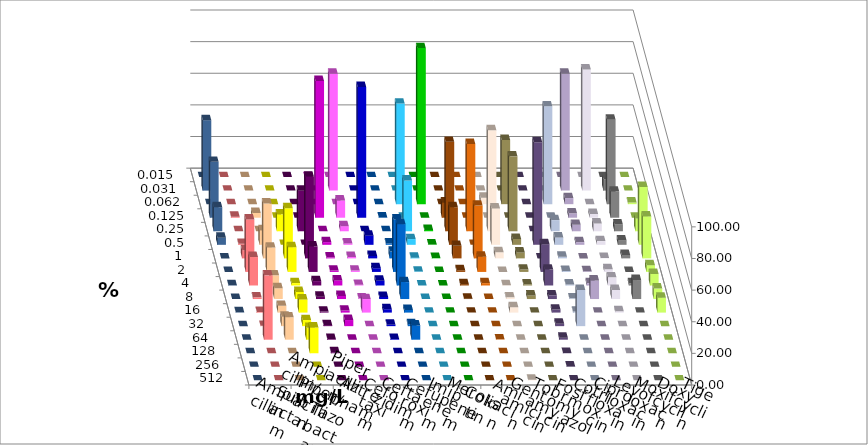
| Category | Ampicillin | Ampicillin/ Sulbactam | Piperacillin | Piperacillin/ Tazobactam | Aztreonam | Cefotaxim | Ceftazidim | Cefuroxim | Imipenem | Meropenem | Colistin | Amikacin | Gentamicin | Tobramycin | Fosfomycin | Cotrimoxazol | Ciprofloxacin | Levofloxacin | Moxifloxacin | Doxycyclin | Tigecyclin |
|---|---|---|---|---|---|---|---|---|---|---|---|---|---|---|---|---|---|---|---|---|---|
| 0.015 | 0 | 0 | 0 | 0 | 0 | 0 | 0 | 0 | 0 | 0 | 0 | 0 | 0 | 0 | 0 | 0 | 0 | 0 | 0 | 0 | 0 |
| 0.031 | 0 | 0 | 0 | 0 | 0 | 73.876 | 0 | 0 | 0 | 0 | 0 | 0 | 0 | 0 | 0 | 0 | 73.876 | 76.66 | 7.296 | 0 | 44.54 |
| 0.062 | 0 | 0 | 0 | 0 | 0 | 0 | 0 | 0 | 63.597 | 98.715 | 0 | 0 | 4.077 | 40.602 | 0 | 61.884 | 3.854 | 0 | 53.433 | 1.071 | 0 |
| 0.125 | 0.642 | 2.998 | 0 | 0 | 86.481 | 10.921 | 82.655 | 0.214 | 0 | 0 | 9.636 | 0 | 0 | 0 | 0 | 0 | 2.784 | 2.355 | 16.524 | 0 | 35.332 |
| 0.25 | 0 | 0 | 10.707 | 25.696 | 0 | 3.212 | 0 | 0 | 32.12 | 0.857 | 56.531 | 55.246 | 63.948 | 47.368 | 0 | 7.066 | 4.069 | 4.925 | 4.292 | 8.137 | 15.203 |
| 0.5 | 0.642 | 9.208 | 0 | 0 | 1.717 | 0.857 | 5.782 | 0.857 | 3.64 | 0.214 | 23.769 | 0 | 22.961 | 3.759 | 64.882 | 4.711 | 1.713 | 2.355 | 2.79 | 36.617 | 4.497 |
| 1.0 | 5.139 | 34.69 | 31.692 | 51.606 | 0.644 | 0.857 | 1.499 | 4.283 | 0.428 | 0.214 | 7.923 | 33.405 | 3.863 | 3.759 | 0 | 1.071 | 0 | 0.214 | 2.146 | 26.552 | 0 |
| 2.0 | 33.191 | 15.418 | 15.632 | 16.06 | 0.858 | 0.857 | 2.355 | 33.191 | 0.214 | 0 | 1.071 | 9.636 | 0 | 1.504 | 17.559 | 0.642 | 0.428 | 1.713 | 0 | 4.283 | 0 |
| 4.0 | 17.987 | 6.424 | 1.499 | 2.784 | 3.219 | 0.428 | 2.998 | 38.758 | 0 | 0 | 0.857 | 1.499 | 0.215 | 0.752 | 10.064 | 0.642 | 1.499 | 5.139 | 1.502 | 7.281 | 0.214 |
| 8.0 | 1.071 | 6.852 | 4.497 | 1.499 | 1.931 | 0.428 | 1.285 | 10.707 | 0 | 0 | 0.214 | 0 | 1.073 | 2.256 | 2.355 | 0.428 | 11.777 | 5.782 | 12.017 | 6.638 | 0 |
| 16.0 | 0.428 | 4.283 | 8.351 | 0.642 | 1.288 | 8.565 | 2.141 | 1.713 | 0 | 0 | 0 | 0 | 3.433 | 0 | 1.927 | 0.642 | 0 | 0.857 | 0 | 9.422 | 0.214 |
| 32.0 | 0.214 | 5.996 | 3.854 | 0.642 | 3.863 | 0 | 0.857 | 1.285 | 0 | 0 | 0 | 0 | 0 | 0 | 1.499 | 22.912 | 0 | 0 | 0 | 0 | 0 |
| 64.0 | 40.685 | 14.133 | 7.495 | 0.428 | 0 | 0 | 0.428 | 8.994 | 0 | 0 | 0 | 0.214 | 0 | 0 | 1.285 | 0 | 0 | 0 | 0 | 0 | 0 |
| 128.0 | 0 | 0 | 16.274 | 0.642 | 0 | 0 | 0 | 0 | 0 | 0 | 0 | 0 | 0 | 0 | 0.214 | 0 | 0 | 0 | 0 | 0 | 0 |
| 256.0 | 0 | 0 | 0 | 0 | 0 | 0 | 0 | 0 | 0 | 0 | 0 | 0 | 0 | 0 | 0.214 | 0 | 0 | 0 | 0 | 0 | 0 |
| 512.0 | 0 | 0 | 0 | 0 | 0 | 0 | 0 | 0 | 0 | 0 | 0 | 0 | 0.429 | 0 | 0 | 0 | 0 | 0 | 0 | 0 | 0 |